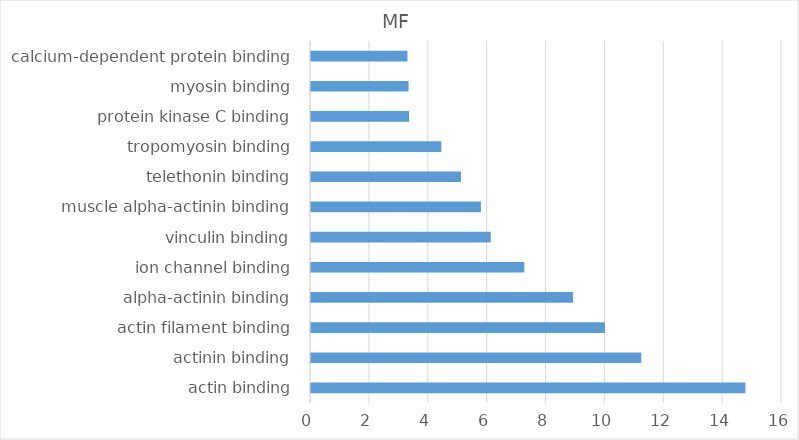
| Category | Bejamini2 |
|---|---|
| actin binding | 14.757 |
| actinin binding | 11.219 |
| actin filament binding | 9.989 |
| alpha-actinin binding | 8.903 |
| ion channel binding | 7.247 |
| vinculin binding | 6.105 |
| muscle alpha-actinin binding | 5.77 |
| telethonin binding | 5.093 |
| tropomyosin binding | 4.428 |
| protein kinase C binding | 3.331 |
| myosin binding | 3.314 |
| calcium-dependent protein binding | 3.275 |